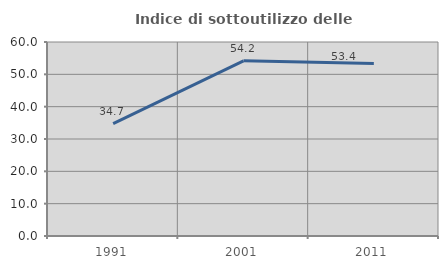
| Category | Indice di sottoutilizzo delle abitazioni  |
|---|---|
| 1991.0 | 34.737 |
| 2001.0 | 54.182 |
| 2011.0 | 53.357 |